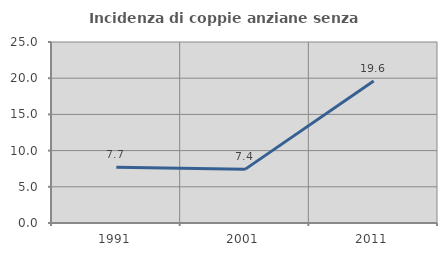
| Category | Incidenza di coppie anziane senza figli  |
|---|---|
| 1991.0 | 7.692 |
| 2001.0 | 7.407 |
| 2011.0 | 19.608 |